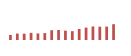
| Category | Importações (2) |
|---|---|
| 0 | 63256.661 |
| 1 | 80362.628 |
| 2 | 79098.748 |
| 3 | 89493.365 |
| 4 | 81914.569 |
| 5 | 86371.3 |
| 6 | 122399.001 |
| 7 | 125153.991 |
| 8 | 116754.909 |
| 9 | 110190.536 |
| 10 | 137205.926 |
| 11 | 154727.051 |
| 12 | 169208.338 |
| 13 | 166254.713 |
| 14 | 167736.792 |
| 15 | 197368.769 |